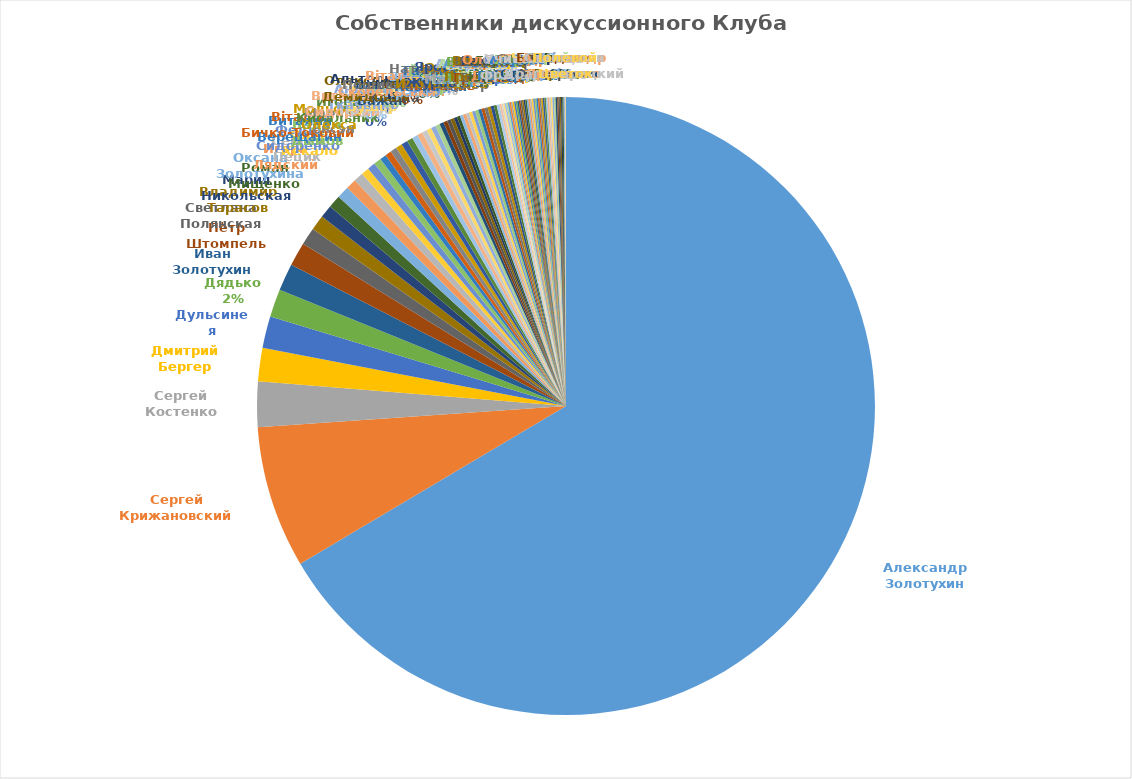
| Category | Series 0 | Series 1 | Series 2 | Series 3 | Series 4 | Series 5 |
|---|---|---|---|---|---|---|
| Александр Золотухин |  |  |  |  |  | 801.9 |
| Сергей Крижановский |  |  |  |  |  | 89.6 |
| Сергей Костенко |  |  |  |  |  | 28.6 |
| Дмитрий Бергер |  |  |  |  |  | 21 |
| Дульсинея |  |  |  |  |  | 20 |
| Дядько |  |  |  |  |  | 17.6 |
| Иван Золотухин |  |  |  |  |  | 17.2 |
| Пётр Штомпель |  |  |  |  |  | 15 |
| Светлана Полянская |  |  |  |  |  | 11 |
| Владимир Тарасов |  |  |  |  |  | 9.6 |
| Мария Никольская |  |  |  |  |  | 8 |
| Роман Мищенко |  |  |  |  |  | 8 |
| Оксана Золотухина |  |  |  |  |  | 7.8 |
| Игорь Лядский |  |  |  |  |  | 6.6 |
| Сергей Пецик |  |  |  |  |  | 6 |
| Олег Кекало |  |  |  |  |  | 5 |
| Федір Сидоренко |  |  |  |  |  | 5 |
| Вадим Дымов |  |  |  |  |  | 4.7 |
| Виталий Верещагин |  |  |  |  |  | 4 |
| Віталій Бичко-Токовий |  |  |  |  |  | 4 |
| Марина Енсэн |  |  |  |  |  | 4 |
| Мольфар Олекса |  |  |  |  |  | 4 |
| Ноир |  |  |  |  |  | 4 |
| Игорь Кибальник |  |  |  |  |  | 3.8 |
| Юмарси |  |  |  |  |  | 3.6 |
| Виталий Сидоркин |  |  |  |  |  | 3.4 |
| Ольга Пругло |  |  |  |  |  | 3.2 |
| Алина Бушер |  |  |  |  |  | 3 |
| Андрей Ткаченко |  |  |  |  |  | 3 |
| Тирамису |  |  |  |  |  | 2.8 |
| Виктор Бажан |  |  |  |  |  | 2.6 |
| Ариэль |  |  |  |  |  | 2.4 |
| Дикая Кошка |  |  |  |  |  | 2.4 |
| Олександр Демидович |  |  |  |  |  | 2.2 |
| Альтернативщик |  |  |  |  |  | 2 |
| Афина |  |  |  |  |  | 2 |
| Весна Красна |  |  |  |  |  | 2 |
| Віталій Скобельський |  |  |  |  |  | 2 |
| Воля |  |  |  |  |  | 2 |
| Дейдара |  |  |  |  |  | 2 |
| Едуард Фісун |  |  |  |  |  | 2 |
| Йеннифер |  |  |  |  |  | 2 |
| Галина Казначей |  |  |  |  |  | 2 |
| Олег Мингалёв |  |  |  |  |  | 2 |
| Наталя Пошивайло-Таулер |  |  |  |  |  | 2 |
| Юлия Иноземцева |  |  |  |  |  | 2 |
| Ярослав Журавель |  |  |  |  |  | 2 |
| Алиса |  |  |  |  |  | 1.8 |
| Водолей |  |  |  |  |  | 1.8 |
| Чайка |  |  |  |  |  | 1.2 |
| Акелла |  |  |  |  |  | 1 |
| Алевтина |  |  |  |  |  | 1 |
| Александр П |  |  |  |  |  | 1 |
| Алексей Шерстнёв |  |  |  |  |  | 1 |
| Альона Гончаренко |  |  |  |  |  | 1 |
| Андрей Гарнат |  |  |  |  |  | 1 |
| Андрій Матковський |  |  |  |  |  | 1 |
| Багира |  |  |  |  |  | 1 |
| Боливар |  |  |  |  |  | 1 |
| Валентин Журавель |  |  |  |  |  | 1 |
| Василій Фазан |  |  |  |  |  | 1 |
| Виталий Грибовод |  |  |  |  |  | 1 |
| Владимир Величко |  |  |  |  |  | 1 |
| Владимир Прокопенко |  |  |  |  |  | 1 |
| Гажиенко Лариса |  |  |  |  |  | 1 |
| Герман Юрченко |  |  |  |  |  | 1 |
| Глобал |  |  |  |  |  | 1 |
| Олександр Дедюхін |  |  |  |  |  | 1 |
| Євгеній Маслак |  |  |  |  |  | 1 |
| Иван Окара |  |  |  |  |  | 1 |
| Івженко Олексій |  |  |  |  |  | 1 |
| Борис Лозовский |  |  |  |  |  | 1 |
| Марина Погорелая |  |  |  |  |  | 1 |
| Оксана Деркач |  |  |  |  |  | 1 |
| Оксана Солопко |  |  |  |  |  | 1 |
| Олег Слизько |  |  |  |  |  | 1 |
| Олег Щебетюк |  |  |  |  |  | 1 |
| Ольга Самофалова |  |  |  |  |  | 1 |
| Роман Широких |  |  |  |  |  | 1 |
| Такс-сист |  |  |  |  |  | 1 |
| Учительница французского |  |  |  |  |  | 1 |
| Человек Маска |  |  |  |  |  | 1 |
| Юлія Стиркіна |  |  |  |  |  | 1 |
| Юрий Кизь |  |  |  |  |  | 1 |
| Янина Стемковская |  |  |  |  |  | 1 |
| Блондинка |  |  |  |  |  | 0.8 |
| Марина Федорова |  |  |  |  |  | 0.8 |
| Мать Тереза |  |  |  |  |  | 0.8 |
| Прима |  |  |  |  |  | 0.8 |
| Хелен |  |  |  |  |  | 0.8 |
| Юлия |  |  |  |  |  | 0.8 |
| Александр Яременко |  |  |  |  |  | 0.3 |
| Станислав Драгомирецкий |  |  |  |  |  | 0.2 |
| Полевой Цветок |  |  |  |  |  | 0.2 |